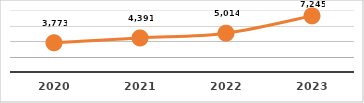
| Category | SERVICIOS TECNOLÓGICOS PROPORCIONADOS
PRIMER SEMESTRE, EJERCICIO 2023 |
|---|---|
| 2020.0 | 3773 |
| 2021.0 | 4391 |
| 2022.0 | 5014 |
| 2023.0 | 7245 |